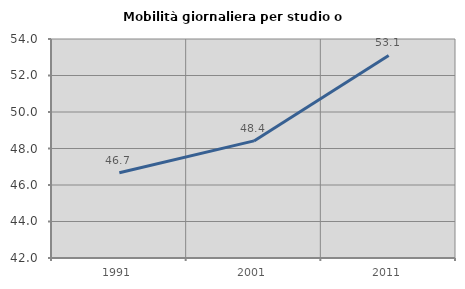
| Category | Mobilità giornaliera per studio o lavoro |
|---|---|
| 1991.0 | 46.671 |
| 2001.0 | 48.416 |
| 2011.0 | 53.1 |